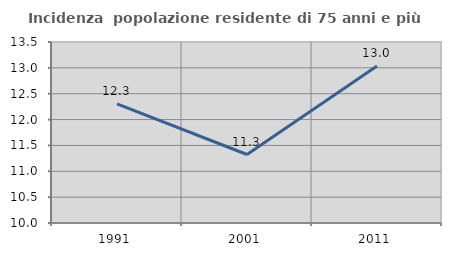
| Category | Incidenza  popolazione residente di 75 anni e più |
|---|---|
| 1991.0 | 12.302 |
| 2001.0 | 11.324 |
| 2011.0 | 13.035 |